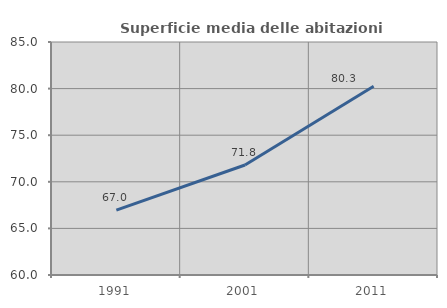
| Category | Superficie media delle abitazioni occupate |
|---|---|
| 1991.0 | 66.962 |
| 2001.0 | 71.804 |
| 2011.0 | 80.252 |